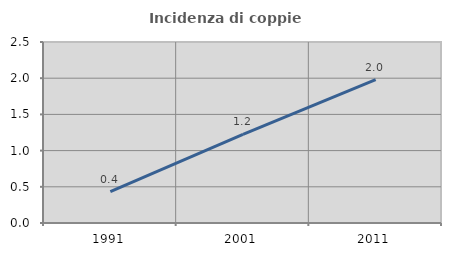
| Category | Incidenza di coppie miste |
|---|---|
| 1991.0 | 0.433 |
| 2001.0 | 1.223 |
| 2011.0 | 1.979 |